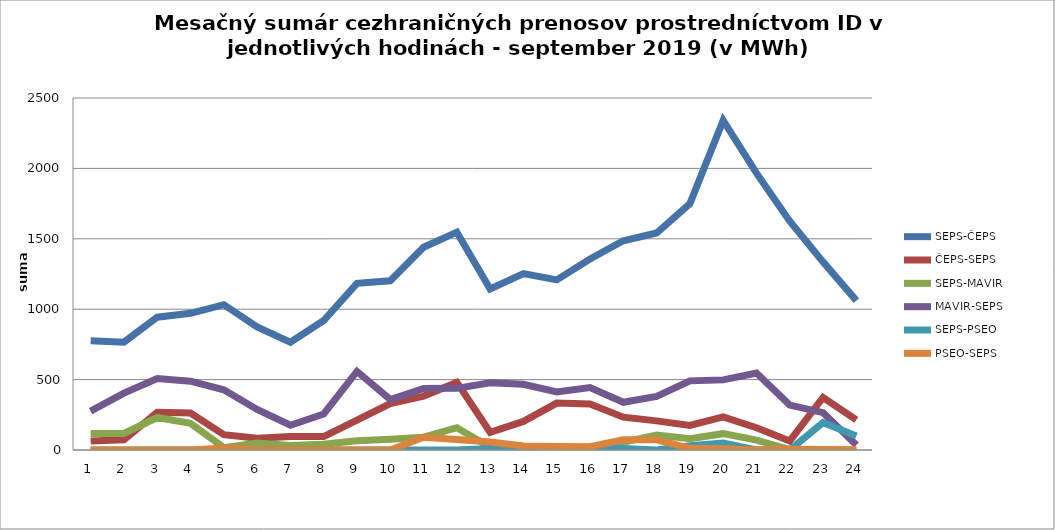
| Category | SEPS-ČEPS | ČEPS-SEPS | SEPS-MAVIR | MAVIR-SEPS | SEPS-PSEO | PSEO-SEPS |
|---|---|---|---|---|---|---|
| 1.0 | 776 | 64 | 117 | 276 | 0 | 0 |
| 2.0 | 766 | 73 | 117 | 404 | 0 | 0 |
| 3.0 | 943 | 268 | 231 | 507 | 0 | 0 |
| 4.0 | 971 | 263 | 189 | 489 | 0 | 0 |
| 5.0 | 1032 | 109 | 17 | 428 | 0 | 15 |
| 6.0 | 874 | 84 | 50 | 288 | 0 | 0 |
| 7.0 | 766 | 95 | 32 | 176 | 0 | 0 |
| 8.0 | 920 | 95 | 41 | 256 | 0 | 0 |
| 9.0 | 1184 | 212 | 66 | 558 | 0 | 0 |
| 10.0 | 1202 | 330 | 76 | 359 | 0 | 0 |
| 11.0 | 1440 | 383 | 91 | 437 | 0 | 90 |
| 12.0 | 1547 | 480 | 158 | 438 | 0 | 75 |
| 13.0 | 1144 | 126 | 20 | 478 | 10 | 57 |
| 14.0 | 1253 | 203 | 2 | 467 | 10 | 29 |
| 15.0 | 1208 | 333 | 16 | 413 | 14 | 25 |
| 16.0 | 1357 | 327 | 15 | 444 | 13 | 23 |
| 17.0 | 1486 | 233 | 55 | 339 | 10 | 72 |
| 18.0 | 1541 | 207 | 107 | 380 | 0 | 72 |
| 19.0 | 1750 | 174 | 80 | 491 | 30 | 12 |
| 20.0 | 2341 | 235 | 116 | 498 | 50 | 8 |
| 21.0 | 1966 | 158 | 70 | 547 | 0 | 0 |
| 22.0 | 1625 | 64 | 3 | 319 | 0 | 5 |
| 23.0 | 1336 | 373 | 0 | 265 | 195 | 3 |
| 24.0 | 1061 | 214 | 0 | 36 | 100 | 2 |